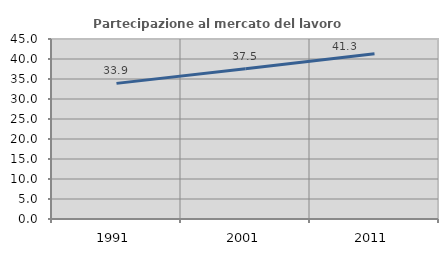
| Category | Partecipazione al mercato del lavoro  femminile |
|---|---|
| 1991.0 | 33.908 |
| 2001.0 | 37.537 |
| 2011.0 | 41.33 |